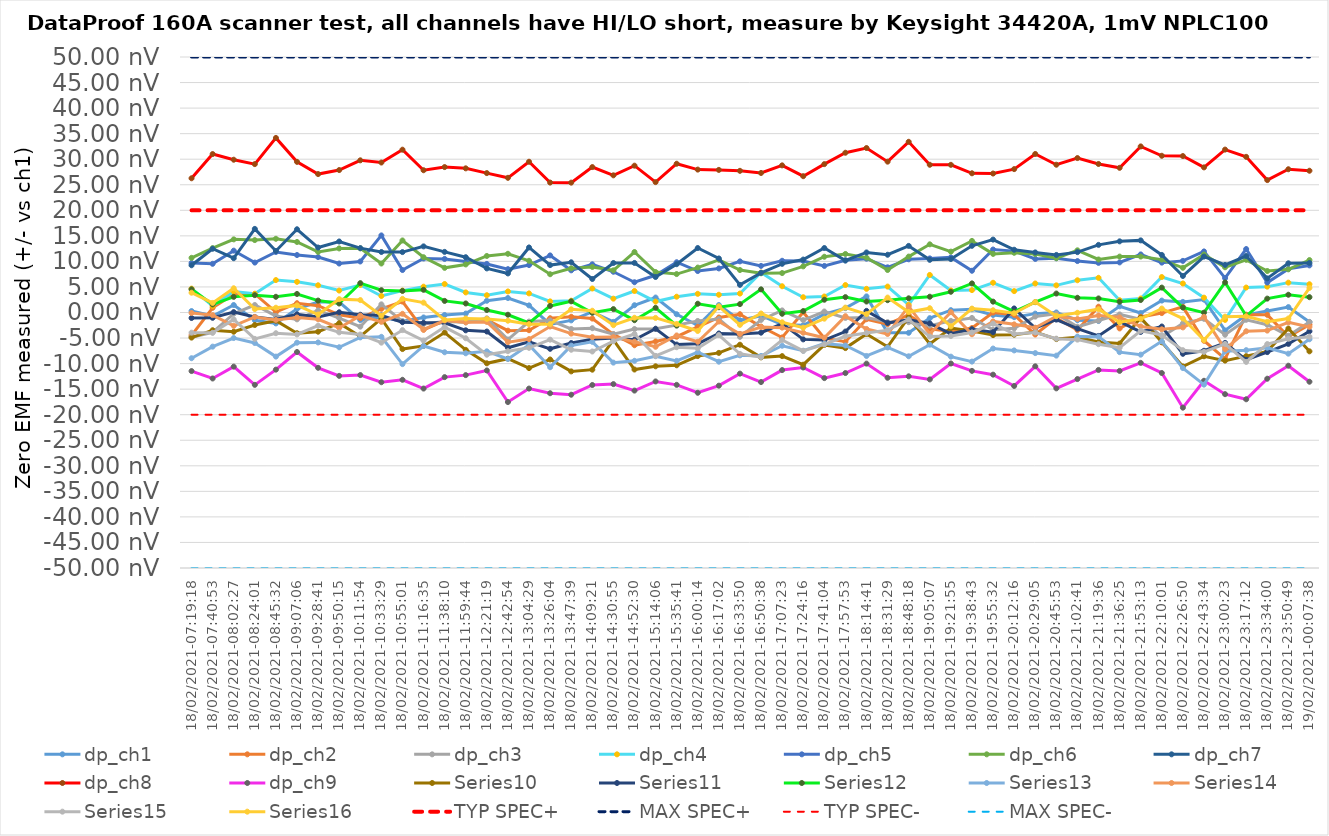
| Category | dp_ch1 | dp_ch2 | dp_ch3 | dp_ch4 | dp_ch5 | dp_ch6 | dp_ch7 | dp_ch8 | dp_ch9 | Series 9 | Series 10 | Series 11 | Series 12 | Series 13 | Series 14 | Series 15 | TYP SPEC+ | MAX SPEC+ | TYP SPEC- | MAX SPEC- |
|---|---|---|---|---|---|---|---|---|---|---|---|---|---|---|---|---|---|---|---|---|
| 18/02/2021-07:19:18 | 0.282 | -4.473 | -4.827 | 4.672 | 9.695 | 10.698 | 9.242 | 26.267 | -11.458 | -4.91 | -1.08 | 4.543 | -8.947 | -0.1 | -3.948 | 3.873 | 20 | 50 | -20 | -50 |
| 18/02/2021-07:40:53 | -0.7 | 0.923 | -3.873 | 1.283 | 9.53 | 12.6 | 12.478 | 31.007 | -12.912 | -3.472 | -1.04 | 1.577 | -6.68 | -0.513 | -3.977 | 1.877 | 20 | 50 | -20 | -50 |
| 18/02/2021-08:02:27 | 1.467 | 3.595 | -0.235 | 4.112 | 12.103 | 14.312 | 10.627 | 29.9 | -10.597 | -3.762 | 0.078 | 3.062 | -4.998 | -2.608 | -1.357 | 4.742 | 20 | 50 | -20 | -50 |
| 18/02/2021-08:24:01 | -1.508 | 3.625 | 1.468 | 3.675 | 9.768 | 14.173 | 16.362 | 29.04 | -14.16 | -2.445 | -0.87 | 3.398 | -5.967 | -0.878 | -5.162 | 0.672 | 20 | 50 | -20 | -50 |
| 18/02/2021-08:45:32 | -2.137 | 0.088 | -0.673 | 6.347 | 11.838 | 14.425 | 12.047 | 34.165 | -11.18 | -1.607 | -1.385 | 3.073 | -8.632 | -1.452 | -4.053 | 0.935 | 20 | 50 | -20 | -50 |
| 18/02/2021-09:07:06 | 0.708 | 1.82 | -1.34 | 5.997 | 11.248 | 13.808 | 16.288 | 29.483 | -7.728 | -4.057 | -0.362 | 3.628 | -5.905 | -0.983 | -4.293 | 1.388 | 20 | 50 | -20 | -50 |
| 18/02/2021-09:28:41 | 2.057 | 1.323 | 0.4 | 5.328 | 10.845 | 11.857 | 12.717 | 27.092 | -10.823 | -3.757 | -0.872 | 2.333 | -5.853 | -1.323 | -2.587 | -0.402 | 20 | 50 | -20 | -50 |
| 18/02/2021-09:50:15 | 2.042 | -0.442 | -1.09 | 4.292 | 9.583 | 12.538 | 13.9 | 27.877 | -12.403 | -2.1 | 0.043 | 1.758 | -6.798 | -3.018 | -3.885 | 2.613 | 20 | 50 | -20 | -50 |
| 18/02/2021-10:11:54 | -1.49 | -1.118 | -2.772 | 5.383 | 9.985 | 12.557 | 12.597 | 29.778 | -12.243 | -4.688 | -0.44 | 5.745 | -4.877 | -0.617 | -4.308 | 2.428 | 20 | 50 | -20 | -50 |
| 18/02/2021-10:33:29 | -0.877 | 0.718 | 1.597 | 3.228 | 15.085 | 9.588 | 11.842 | 29.348 | -13.643 | -1.192 | -0.59 | 4.367 | -4.76 | -1.835 | -5.905 | -0.628 | 20 | 50 | -20 | -50 |
| 18/02/2021-10:55:01 | -1.732 | 2.142 | -1.742 | 4.282 | 8.312 | 14.097 | 11.823 | 31.862 | -13.168 | -7.155 | -1.893 | 4.232 | -10.105 | -0.255 | -3.447 | 2.67 | 20 | 50 | -20 | -50 |
| 18/02/2021-11:16:35 | -0.975 | -3.385 | -2.258 | 5.053 | 10.57 | 10.818 | 12.94 | 27.84 | -14.885 | -6.542 | -2.013 | 4.442 | -6.545 | -3.3 | -5.507 | 1.928 | 20 | 50 | -20 | -50 |
| 18/02/2021-11:38:10 | -0.49 | -1.573 | -1.76 | 5.58 | 10.485 | 8.737 | 11.863 | 28.46 | -12.647 | -3.923 | -2.023 | 2.267 | -7.782 | -1.568 | -2.852 | -1.453 | 20 | 50 | -20 | -50 |
| 18/02/2021-11:59:44 | -0.212 | -1.893 | -1.915 | 3.928 | 9.965 | 9.405 | 10.818 | 28.21 | -12.255 | -7.313 | -3.488 | 1.767 | -7.983 | -1.923 | -5.037 | -1.167 | 20 | 50 | -20 | -50 |
| 18/02/2021-12:21:19 | 2.295 | -1.435 | -1.143 | 3.383 | 9.507 | 11.062 | 8.627 | 27.28 | -11.34 | -9.94 | -3.723 | 0.487 | -7.602 | -1.852 | -8.263 | -1.253 | 20 | 50 | -20 | -50 |
| 18/02/2021-12:42:54 | 2.833 | -3.552 | -5.288 | 4.122 | 8.485 | 11.488 | 7.642 | 26.355 | -17.527 | -9.038 | -6.9 | -0.438 | -9.098 | -5.798 | -7.572 | -1.607 | 20 | 50 | -20 | -50 |
| 18/02/2021-13:04:29 | 1.388 | -3.465 | -1.773 | 3.738 | 9.282 | 10.122 | 12.73 | 29.505 | -14.887 | -10.877 | -5.748 | -2.038 | -6.335 | -5.205 | -6.918 | -2.278 | 20 | 50 | -20 | -50 |
| 18/02/2021-13:26:04 | -2.323 | -1.118 | -1.553 | 2.177 | 11.172 | 7.49 | 9.277 | 25.427 | -15.798 | -9.193 | -7.107 | 1.288 | -10.71 | -2.745 | -5.317 | -2.29 | 20 | 50 | -20 | -50 |
| 18/02/2021-13:47:39 | -1.54 | -0.838 | -3.228 | 2.31 | 8.253 | 8.64 | 9.825 | 25.412 | -16.09 | -11.525 | -5.978 | 2.187 | -6.478 | -4.137 | -7.29 | 0.618 | 20 | 50 | -20 | -50 |
| 18/02/2021-14:09:21 | 0.11 | -1.187 | -3.072 | 4.695 | 9.432 | 8.917 | 6.557 | 28.46 | -14.187 | -11.19 | -5.24 | -0.055 | -5.738 | -4.827 | -7.628 | 0.345 | 20 | 50 | -20 | -50 |
| 18/02/2021-14:30:55 | -1.837 | -4.272 | -4.227 | 2.707 | 7.97 | 8.252 | 9.688 | 26.843 | -14.013 | -5.347 | -4.973 | 0.665 | -9.808 | -4.815 | -5.615 | -2.482 | 20 | 50 | -20 | -50 |
| 18/02/2021-14:52:30 | 1.425 | -6.407 | -3.235 | 4.212 | 5.92 | 11.838 | 9.698 | 28.733 | -15.283 | -11.158 | -5.327 | -1.505 | -9.45 | -5.702 | -4.203 | -1.027 | 20 | 50 | -20 | -50 |
| 18/02/2021-15:14:06 | 2.928 | -5.67 | -3.192 | 2.142 | 7.288 | 7.922 | 6.945 | 25.517 | -13.49 | -10.53 | -3.178 | 0.922 | -8.553 | -6.707 | -8.497 | -1.055 | 20 | 50 | -20 | -50 |
| 18/02/2021-15:35:41 | -0.345 | -4.742 | -2.47 | 3.09 | 9.838 | 7.522 | 9.452 | 29.112 | -14.158 | -10.33 | -6.278 | -2.57 | -9.46 | -4.49 | -6.795 | -2.245 | 20 | 50 | -20 | -50 |
| 18/02/2021-16:00:14 | -2.54 | -2.823 | -1.652 | 3.655 | 8.11 | 8.792 | 12.618 | 27.967 | -15.71 | -8.528 | -6.097 | 1.715 | -7.758 | -5.73 | -6.993 | -3.613 | 20 | 50 | -20 | -50 |
| 18/02/2021-16:17:02 | 1.46 | -0.97 | -1.278 | 3.472 | 8.625 | 10.31 | 10.575 | 27.905 | -14.32 | -7.905 | -4.108 | 1.032 | -9.625 | -1.765 | -4.41 | 1.21 | 20 | 50 | -20 | -50 |
| 18/02/2021-16:33:50 | -1.532 | -0.332 | -4.765 | 3.71 | 10.008 | 8.312 | 5.405 | 27.725 | -11.962 | -6.305 | -4.218 | 1.64 | -8.39 | -4.205 | -8.092 | -2.42 | 20 | 50 | -20 | -50 |
| 18/02/2021-16:50:38 | -0.625 | -2.755 | -1.453 | 7.822 | 9.122 | 7.672 | 7.762 | 27.308 | -13.61 | -8.78 | -3.95 | 4.53 | -8.495 | -2.85 | -8.742 | -0.195 | 20 | 50 | -20 | -50 |
| 18/02/2021-17:07:23 | -2.372 | -4.888 | 0.41 | 5.14 | 10.122 | 7.717 | 9.525 | 28.792 | -11.268 | -8.535 | -2.185 | -0.25 | -6.505 | -2.96 | -5.372 | -1.918 | 20 | 50 | -20 | -50 |
| 18/02/2021-17:24:16 | -2.518 | 0.058 | -1.492 | 2.988 | 10.085 | 9.028 | 10.36 | 26.675 | -10.762 | -10.215 | -5.26 | 0.283 | -7.49 | -3.96 | -7.517 | -2.978 | 20 | 50 | -20 | -50 |
| 18/02/2021-17:41:04 | -0.308 | -5.022 | 0.195 | 3.128 | 9.112 | 10.91 | 12.618 | 29.038 | -12.84 | -6.352 | -5.392 | 2.5 | -6.095 | -4.942 | -6.243 | -1.208 | 20 | 50 | -20 | -50 |
| 18/02/2021-17:57:53 | 0.852 | -5.717 | -1.055 | 5.377 | 10.21 | 11.452 | 10.173 | 31.262 | -11.848 | -6.962 | -3.73 | 3.01 | -6.455 | -0.72 | -4.652 | 0.958 | 20 | 50 | -20 | -50 |
| 18/02/2021-18:14:41 | 3.155 | -1.312 | -0.978 | 4.635 | 10.53 | 10.728 | 11.75 | 32.19 | -10.002 | -4.198 | 0.318 | 2.148 | -8.505 | -3.225 | -4.01 | -0.32 | 20 | 50 | -20 | -50 |
| 18/02/2021-18:31:29 | -3.96 | -2.295 | -1.878 | 5.072 | 8.84 | 8.317 | 11.302 | 29.52 | -12.775 | -6.72 | -2.05 | 2.412 | -6.838 | -4.205 | -3.455 | 2.92 | 20 | 50 | -20 | -50 |
| 18/02/2021-18:48:18 | -3.972 | -0.462 | -1.892 | 1.513 | 10.41 | 10.942 | 13.035 | 33.405 | -12.49 | -0.915 | -1.41 | 2.775 | -8.565 | 1.198 | -1.36 | 0.085 | 20 | 50 | -20 | -50 |
| 18/02/2021-19:05:07 | -1.108 | -3.205 | -2.57 | 7.35 | 10.585 | 13.342 | 10.305 | 28.91 | -13.098 | -6.148 | -2.132 | 3.088 | -6.3 | -4.208 | -4.708 | 0.837 | 20 | 50 | -20 | -50 |
| 18/02/2021-19:21:55 | 0.458 | -3.725 | -1.638 | 4.312 | 10.788 | 11.912 | 10.462 | 28.898 | -9.978 | -3.038 | -4.175 | 4.055 | -8.64 | 0.072 | -4.602 | -2.702 | 20 | 50 | -20 | -50 |
| 18/02/2021-19:38:43 | 0.642 | -3.035 | -1.065 | 4.382 | 8.17 | 14.01 | 13.052 | 27.242 | -11.425 | -3.602 | -3.268 | 5.695 | -9.61 | -4.255 | -3.9 | 0.762 | 20 | 50 | -20 | -50 |
| 18/02/2021-19:55:32 | -0.483 | -0.01 | -3.388 | 5.818 | 12.325 | 11.468 | 14.268 | 27.195 | -12.165 | -4.425 | -3.845 | 2.125 | -7.055 | -1.748 | -2.185 | 0.438 | 20 | 50 | -20 | -50 |
| 18/02/2021-20:12:16 | -0.91 | -0.45 | -3.105 | 4.185 | 12.01 | 11.685 | 12.28 | 28.06 | -14.375 | -4.348 | 0.79 | 0.185 | -7.422 | -2.32 | -4.195 | -0.145 | 20 | 50 | -20 | -50 |
| 18/02/2021-20:29:05 | -0.22 | -4.305 | -0.802 | 5.68 | 10.482 | 11.432 | 11.755 | 31.022 | -10.53 | -3.84 | -3.035 | 2.027 | -7.942 | -2.978 | -3.908 | 2.055 | 20 | 50 | -20 | -50 |
| 18/02/2021-20:45:53 | 0.008 | -1.072 | -0.252 | 5.315 | 10.612 | 10.632 | 11.265 | 28.92 | -14.845 | -5.205 | -1.392 | 3.71 | -8.44 | -0.732 | -5.118 | -0.682 | 20 | 50 | -20 | -50 |
| 18/02/2021-21:02:41 | -1.513 | -3.438 | -2.805 | 6.308 | 10.068 | 12.168 | 11.812 | 30.222 | -13.025 | -4.862 | -3.155 | 2.88 | -4.708 | -1.268 | -5.31 | -0.05 | 20 | 50 | -20 | -50 |
| 18/02/2021-21:19:36 | -1.67 | 1.132 | -1.572 | 6.792 | 9.71 | 10.372 | 13.232 | 29.065 | -11.242 | -5.76 | -4.59 | 2.75 | -4.725 | -0.568 | -6.198 | 0.65 | 20 | 50 | -20 | -50 |
| 18/02/2021-21:36:25 | 1.212 | -3.115 | -0.375 | 2.4 | 9.802 | 10.938 | 13.925 | 28.31 | -11.425 | -6.078 | -1.802 | 2.112 | -7.76 | -0.948 | -6.892 | -1.912 | 20 | 50 | -20 | -50 |
| 18/02/2021-21:53:13 | -0.108 | -0.862 | -1.342 | 2.74 | 11.362 | 10.95 | 14.112 | 32.5 | -9.858 | -0.995 | -3.802 | 2.443 | -8.25 | -2.725 | -3.598 | -1.242 | 20 | 50 | -20 | -50 |
| 18/02/2021-22:10:01 | 2.335 | -0.115 | -4.74 | 6.94 | 9.76 | 10.355 | 11.265 | 30.67 | -11.84 | -5.83 | -2.742 | 4.873 | -5.642 | -3.292 | -4.417 | 0.77 | 20 | 50 | -20 | -50 |
| 18/02/2021-22:26:50 | 2.078 | 1.108 | -2.125 | 5.672 | 10.1 | 8.742 | 7.145 | 30.618 | -18.625 | -10.568 | -8.085 | 0.97 | -10.878 | -2.92 | -7.378 | -1.18 | 20 | 50 | -20 | -50 |
| 18/02/2021-22:43:34 | 2.522 | -5.53 | -1.235 | 2.908 | 11.952 | 11.348 | 10.948 | 28.398 | -13.362 | -8.568 | -7.49 | -0.032 | -14.118 | -0.855 | -7.705 | -5.402 | 20 | 50 | -20 | -50 |
| 18/02/2021-23:00:23 | -3.512 | -9.062 | -4.352 | -1.45 | 6.73 | 8.85 | 9.315 | 31.88 | -15.983 | -9.415 | -5.948 | 5.878 | -7.578 | -7.17 | -6.142 | -0.818 | 20 | 50 | -20 | -50 |
| 18/02/2021-23:17:12 | -0.488 | -0.42 | -1.428 | 4.882 | 12.42 | 10.31 | 11.058 | 30.46 | -16.98 | -8.54 | -9.27 | -0.655 | -7.368 | -3.67 | -9.672 | -0.722 | 20 | 50 | -20 | -50 |
| 18/02/2021-23:34:00 | 0.31 | -0.46 | -2.398 | 5.058 | 5.86 | 8.12 | 6.677 | 25.91 | -12.958 | -7.605 | -7.75 | 2.718 | -6.895 | -3.54 | -6.178 | -1.802 | 20 | 50 | -20 | -50 |
| 18/02/2021-23:50:49 | 1.055 | -4.72 | -4.555 | 5.842 | 8.538 | 8.445 | 9.63 | 28.035 | -10.412 | -3.14 | -6.148 | 3.475 | -8.057 | -1.935 | -5.13 | -1.178 | 20 | 50 | -20 | -50 |
| 19/02/2021-00:07:38 | -1.872 | -2.37 | -1.838 | 5.528 | 9.218 | 10.26 | 9.688 | 27.742 | -13.548 | -7.6 | -3.678 | 3 | -5.242 | -2.82 | -4.742 | 4.815 | 20 | 50 | -20 | -50 |